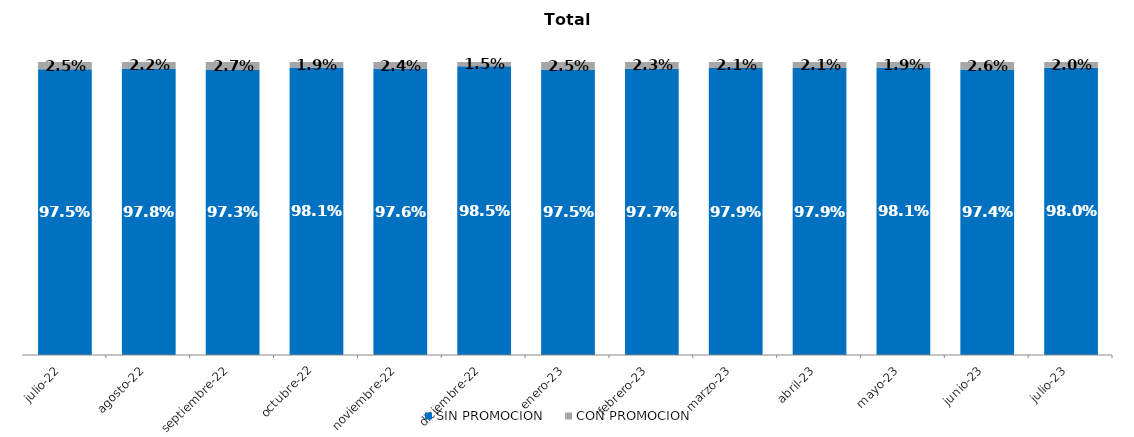
| Category | SIN PROMOCION   | CON PROMOCION   |
|---|---|---|
| 2022-07-01 | 0.975 | 0.025 |
| 2022-08-01 | 0.978 | 0.022 |
| 2022-09-01 | 0.973 | 0.027 |
| 2022-10-01 | 0.981 | 0.019 |
| 2022-11-01 | 0.976 | 0.024 |
| 2022-12-01 | 0.985 | 0.015 |
| 2023-01-01 | 0.975 | 0.025 |
| 2023-02-01 | 0.977 | 0.023 |
| 2023-03-01 | 0.979 | 0.021 |
| 2023-04-01 | 0.979 | 0.021 |
| 2023-05-01 | 0.981 | 0.019 |
| 2023-06-01 | 0.974 | 0.026 |
| 2023-07-01 | 0.98 | 0.02 |